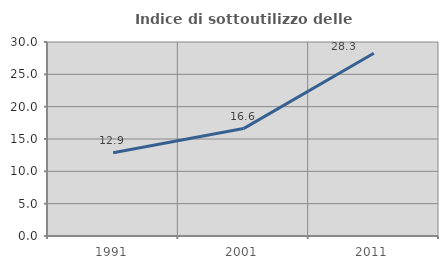
| Category | Indice di sottoutilizzo delle abitazioni  |
|---|---|
| 1991.0 | 12.874 |
| 2001.0 | 16.608 |
| 2011.0 | 28.263 |